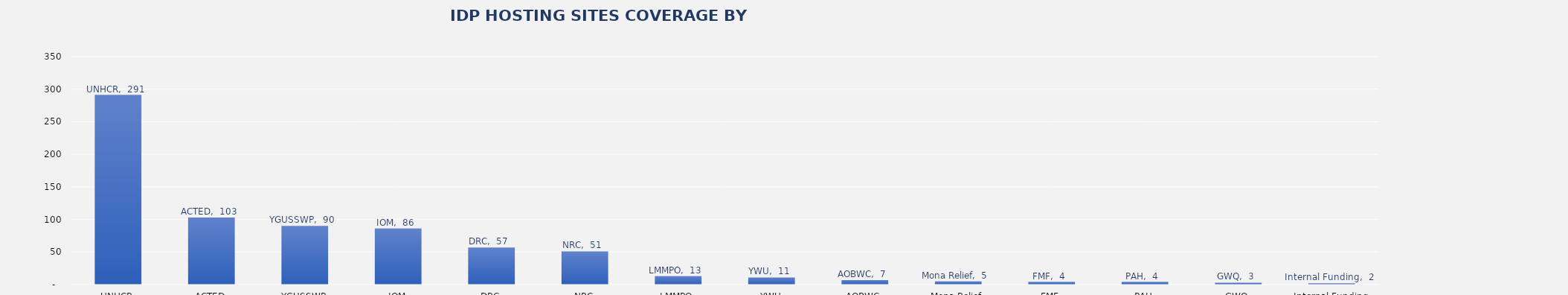
| Category | Total |
|---|---|
| UNHCR | 291 |
| ACTED | 103 |
| YGUSSWP | 90 |
| IOM | 86 |
| DRC | 57 |
| NRC | 51 |
| LMMPO | 13 |
| YWU | 11 |
| AOBWC | 7 |
| Mona Relief | 5 |
| FMF | 4 |
| PAH | 4 |
| GWQ | 3 |
| Internal Funding | 2 |